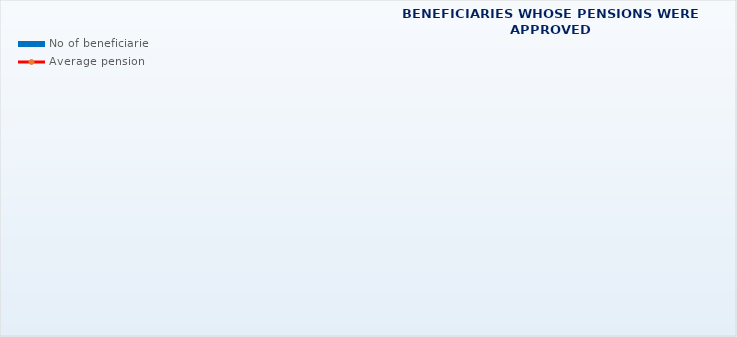
| Category | No of beneficiaries |
|---|---|
| Authorised officials in internal affairs, judicial officers and workers engaged in demining work: | 17264 |
| Pension beneficiaries entitled under the Fire Services Act (Official Gazette 125/19) | 311 |
| Active military personnel - DVO  | 16100 |
| Croatian Homeland Army veterans mobilised from 1941 to 1945 | 2220 |
| Former political prisoners | 2217 |
| Croatian Veterans from the Homeland War - ZOHBDR (Act on Croatian Homeland War Veterans and Their Family Members) | 71253 |
| Pensions approved under general regulations and determined according to the Act on the Rights of Croatian Homeland War Veterans and their Family Members (ZOHBDR), in 2017 (Art. 27, 35, 48 and 49, paragraph 2)    | 55886 |
| Former Yugoslav People's Army members - JNA   | 3992 |
| Former Yugoslav People's Army members - JNA - Art. 185 of Pension Insurance Act (ZOMO)  | 159 |
| National Liberation War veterans - NOR | 5634 |
| Members of the Croatian Parliament, members of the Government, judges of the Constitutional Court and the Auditor General | 686 |
| Members of the Parliamentary Executive Council and administratively retired federal civil servants  (relates to the former SFRY) | 69 |
| Former officials of federal bodies o the former SFRJ -  Article 38 of the Pension Insurance Act (ZOMO) | 21 |
| Full members of the Croatian Academy of Sciences and Arts - HAZU | 127 |
| Miners from the Istrian coal mines "Tupljak" d.d. Labin  | 249 |
| Workers professionally exposed to asbestos | 836 |
| Insurees - crew members on a ship in international and national navigation  - Article  129, paragraph 2 of the Maritime Code | 206 |
| Members of the Croatian Defence Council - HVO  | 6759 |